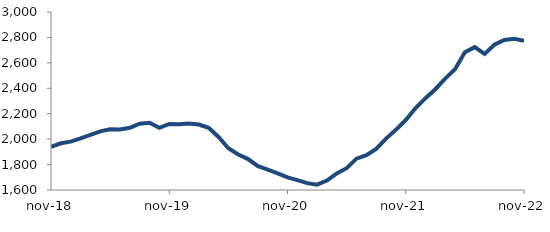
| Category | Series 0 |
|---|---|
| 2018-11-01 | 1938.846 |
| 2018-12-01 | 1967.481 |
| 2019-01-01 | 1980.122 |
| 2019-02-01 | 2005.664 |
| 2019-03-01 | 2033.637 |
| 2019-04-01 | 2060.76 |
| 2019-05-01 | 2078.07 |
| 2019-06-01 | 2076.377 |
| 2019-07-01 | 2089.152 |
| 2019-08-01 | 2121.901 |
| 2019-09-01 | 2128.491 |
| 2019-10-01 | 2088.553 |
| 2019-11-01 | 2119.211 |
| 2019-12-01 | 2116.27 |
| 2020-01-01 | 2123.179 |
| 2020-02-01 | 2115.217 |
| 2020-03-01 | 2088.6 |
| 2020-04-01 | 2017.241 |
| 2020-05-01 | 1928.116 |
| 2020-06-01 | 1878.979 |
| 2020-07-01 | 1843.29 |
| 2020-08-01 | 1787.543 |
| 2020-09-01 | 1760.281 |
| 2020-10-01 | 1731.197 |
| 2020-11-01 | 1698.835 |
| 2020-12-01 | 1677.184 |
| 2021-01-01 | 1654.072 |
| 2021-02-01 | 1641.869 |
| 2021-03-01 | 1673.821 |
| 2021-04-01 | 1730.759 |
| 2021-05-01 | 1771.425 |
| 2021-06-01 | 1846.573 |
| 2021-07-01 | 1874.111 |
| 2021-08-01 | 1922.894 |
| 2021-09-01 | 2004.225 |
| 2021-10-01 | 2073.331 |
| 2021-11-01 | 2150.314 |
| 2021-12-01 | 2244.492 |
| 2022-01-01 | 2321.95 |
| 2022-02-01 | 2392.65 |
| 2022-03-01 | 2476.383 |
| 2022-04-01 | 2549.069 |
| 2022-05-01 | 2683.336 |
| 2022-06-01 | 2723.868 |
| 2022-07-01 | 2670.585 |
| 2022-08-01 | 2742.913 |
| 2022-09-01 | 2780.46 |
| 2022-10-01 | 2788.916 |
| 2022-11-01 | 2772.628 |